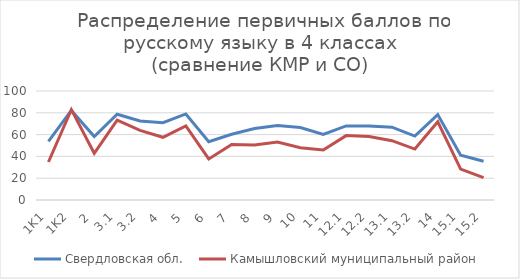
| Category | Свердловская обл. | Камышловский муниципальный район |
|---|---|---|
| 1K1 | 53.75 | 34.85 |
| 1K2 | 82.19 | 82.88 |
| 2 | 58.2 | 42.86 |
| 3,1 | 78.68 | 73.36 |
| 3,2 | 72.47 | 63.84 |
| 4 | 70.89 | 57.53 |
| 5 | 78.95 | 67.95 |
| 6 | 53.42 | 37.64 |
| 7 | 60.29 | 50.84 |
| 8 | 65.59 | 50.39 |
| 9 | 68.26 | 53.28 |
| 10 | 66.44 | 47.88 |
| 11 | 60.2 | 45.95 |
| 12,1 | 67.98 | 59.07 |
| 12,2 | 67.78 | 58.3 |
| 13,1 | 66.82 | 54.44 |
| 13,2 | 58.63 | 46.72 |
| 14 | 78.34 | 71.81 |
| 15,1 | 41.07 | 28.38 |
| 15,2 | 35.49 | 20.46 |